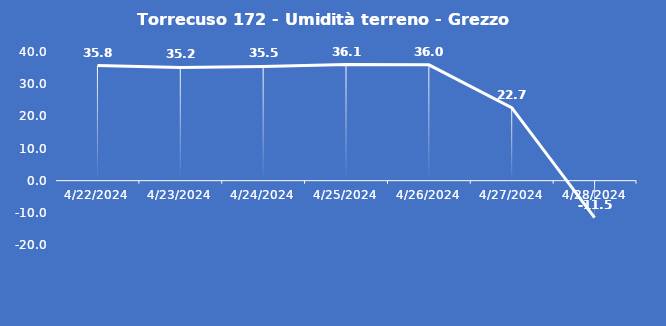
| Category | Torrecuso 172 - Umidità terreno - Grezzo (%VWC) |
|---|---|
| 4/22/24 | 35.8 |
| 4/23/24 | 35.2 |
| 4/24/24 | 35.5 |
| 4/25/24 | 36.1 |
| 4/26/24 | 36 |
| 4/27/24 | 22.7 |
| 4/28/24 | -11.5 |